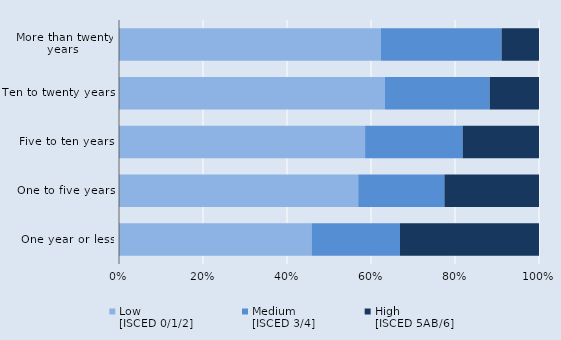
| Category | Low
[ISCED 0/1/2] | Medium 
[ISCED 3/4] | High 
[ISCED 5AB/6] |
|---|---|---|---|
| One year or less | 10677 | 4896 | 7703 |
| One to five years | 43771 | 15770 | 17304 |
| Five to ten years | 42211 | 16737 | 13089 |
| Ten to twenty years | 119531 | 47143 | 22144 |
| More than twenty years  | 483904 | 222828 | 69101 |